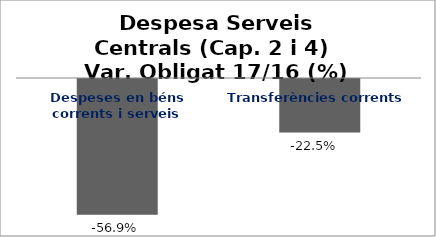
| Category | Series 0 |
|---|---|
| Despeses en béns corrents i serveis | -0.569 |
| Transferències corrents | -0.225 |